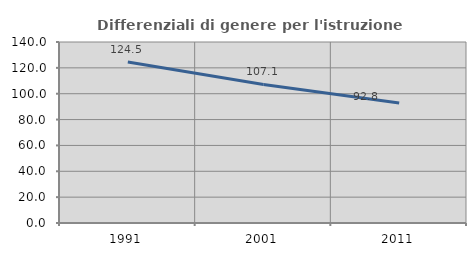
| Category | Differenziali di genere per l'istruzione superiore |
|---|---|
| 1991.0 | 124.519 |
| 2001.0 | 107.132 |
| 2011.0 | 92.786 |